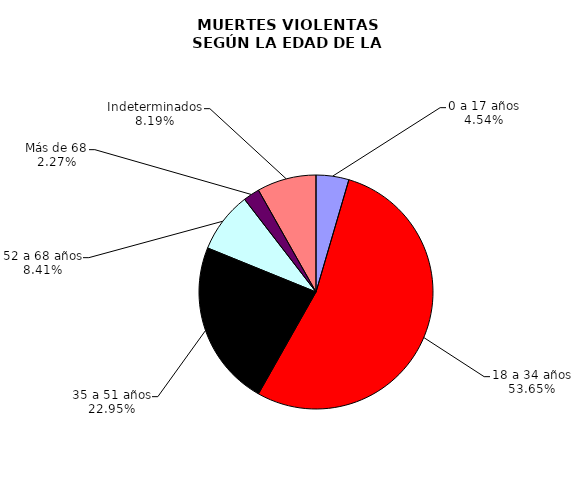
| Category | Series 0 |
|---|---|
| 0 a 17 años | 82 |
| 18 a 34 años | 970 |
| 35 a 51 años | 415 |
| 52 a 68 años | 152 |
| Más de 68 | 41 |
| Indeterminados | 148 |